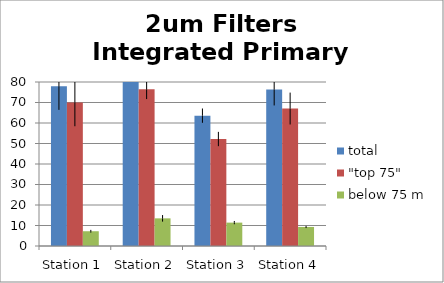
| Category | total | "top 75" | below 75 m |
|---|---|---|---|
| Station 1 | 77.975 | 69.967 | 7.204 |
| Station 2 | 89.934 | 76.449 | 13.485 |
| Station 3 | 63.588 | 52.185 | 11.403 |
| Station 4 | 76.335 | 67.05 | 9.285 |